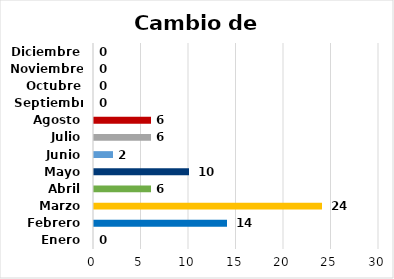
| Category | Cambio de RNC |
|---|---|
| Enero | 0 |
| Febrero | 14 |
| Marzo | 24 |
| Abril | 6 |
| Mayo | 10 |
| Junio | 2 |
| Julio | 6 |
| Agosto | 6 |
| Septiembre | 0 |
| Octubre | 0 |
| Noviembre | 0 |
| Diciembre | 0 |